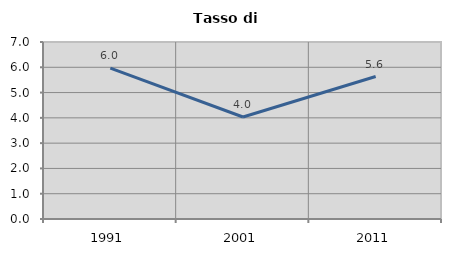
| Category | Tasso di disoccupazione   |
|---|---|
| 1991.0 | 5.97 |
| 2001.0 | 4.034 |
| 2011.0 | 5.634 |